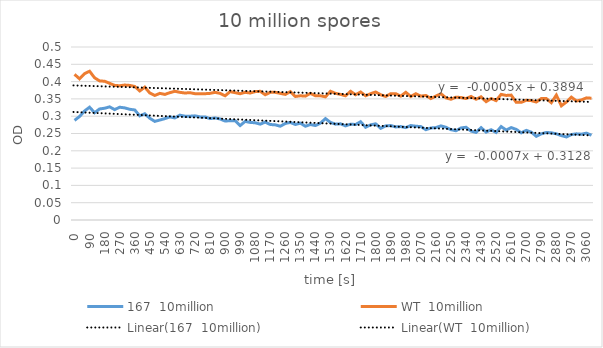
| Category | 167  10million | WT  10million |
|---|---|---|
| 0.0 | 0.288 | 0.421 |
| 30.0 | 0.299 | 0.408 |
| 60.0 | 0.315 | 0.423 |
| 90.0 | 0.326 | 0.43 |
| 120.0 | 0.31 | 0.411 |
| 150.0 | 0.321 | 0.402 |
| 180.0 | 0.323 | 0.401 |
| 210.0 | 0.327 | 0.395 |
| 240.0 | 0.319 | 0.389 |
| 270.0 | 0.326 | 0.388 |
| 300.0 | 0.324 | 0.39 |
| 330.0 | 0.32 | 0.389 |
| 360.0 | 0.318 | 0.386 |
| 390.0 | 0.301 | 0.373 |
| 420.0 | 0.307 | 0.384 |
| 450.0 | 0.294 | 0.367 |
| 480.0 | 0.285 | 0.36 |
| 510.0 | 0.289 | 0.366 |
| 540.0 | 0.293 | 0.363 |
| 570.0 | 0.298 | 0.368 |
| 600.0 | 0.295 | 0.372 |
| 630.0 | 0.303 | 0.369 |
| 660.0 | 0.3 | 0.367 |
| 690.0 | 0.3 | 0.368 |
| 720.0 | 0.301 | 0.365 |
| 750.0 | 0.298 | 0.365 |
| 780.0 | 0.298 | 0.365 |
| 810.0 | 0.293 | 0.366 |
| 840.0 | 0.295 | 0.369 |
| 870.0 | 0.292 | 0.366 |
| 900.0 | 0.286 | 0.359 |
| 930.0 | 0.287 | 0.371 |
| 960.0 | 0.287 | 0.368 |
| 990.0 | 0.273 | 0.365 |
| 1020.0 | 0.285 | 0.369 |
| 1050.0 | 0.282 | 0.367 |
| 1080.0 | 0.281 | 0.371 |
| 1110.0 | 0.277 | 0.372 |
| 1140.0 | 0.283 | 0.362 |
| 1170.0 | 0.276 | 0.369 |
| 1200.0 | 0.275 | 0.369 |
| 1230.0 | 0.271 | 0.366 |
| 1260.0 | 0.279 | 0.363 |
| 1290.0 | 0.282 | 0.371 |
| 1320.0 | 0.276 | 0.357 |
| 1350.0 | 0.28 | 0.359 |
| 1380.0 | 0.271 | 0.358 |
| 1410.0 | 0.276 | 0.366 |
| 1440.0 | 0.273 | 0.359 |
| 1470.0 | 0.28 | 0.359 |
| 1500.0 | 0.293 | 0.356 |
| 1530.0 | 0.282 | 0.372 |
| 1560.0 | 0.277 | 0.366 |
| 1590.0 | 0.278 | 0.363 |
| 1620.0 | 0.272 | 0.359 |
| 1650.0 | 0.277 | 0.372 |
| 1680.0 | 0.276 | 0.362 |
| 1710.0 | 0.284 | 0.37 |
| 1740.0 | 0.268 | 0.359 |
| 1770.0 | 0.275 | 0.365 |
| 1800.0 | 0.278 | 0.37 |
| 1830.0 | 0.265 | 0.362 |
| 1860.0 | 0.272 | 0.357 |
| 1890.0 | 0.273 | 0.365 |
| 1920.0 | 0.269 | 0.365 |
| 1950.0 | 0.27 | 0.358 |
| 1980.0 | 0.267 | 0.369 |
| 2010.0 | 0.273 | 0.357 |
| 2040.0 | 0.271 | 0.365 |
| 2070.0 | 0.27 | 0.358 |
| 2100.0 | 0.261 | 0.36 |
| 2130.0 | 0.266 | 0.351 |
| 2160.0 | 0.267 | 0.358 |
| 2190.0 | 0.272 | 0.365 |
| 2220.0 | 0.268 | 0.353 |
| 2250.0 | 0.261 | 0.349 |
| 2280.0 | 0.258 | 0.355 |
| 2310.0 | 0.266 | 0.354 |
| 2340.0 | 0.268 | 0.351 |
| 2370.0 | 0.257 | 0.357 |
| 2400.0 | 0.253 | 0.349 |
| 2430.0 | 0.267 | 0.356 |
| 2460.0 | 0.254 | 0.342 |
| 2490.0 | 0.261 | 0.351 |
| 2520.0 | 0.253 | 0.345 |
| 2550.0 | 0.27 | 0.363 |
| 2580.0 | 0.26 | 0.36 |
| 2610.0 | 0.267 | 0.361 |
| 2640.0 | 0.262 | 0.34 |
| 2670.0 | 0.252 | 0.34 |
| 2700.0 | 0.259 | 0.346 |
| 2730.0 | 0.254 | 0.345 |
| 2760.0 | 0.242 | 0.341 |
| 2790.0 | 0.249 | 0.351 |
| 2820.0 | 0.253 | 0.351 |
| 2850.0 | 0.252 | 0.339 |
| 2880.0 | 0.249 | 0.361 |
| 2910.0 | 0.244 | 0.33 |
| 2940.0 | 0.24 | 0.341 |
| 2970.0 | 0.247 | 0.355 |
| 3000.0 | 0.249 | 0.344 |
| 3030.0 | 0.248 | 0.347 |
| 3060.0 | 0.251 | 0.353 |
| 3090.0 | 0.245 | 0.352 |